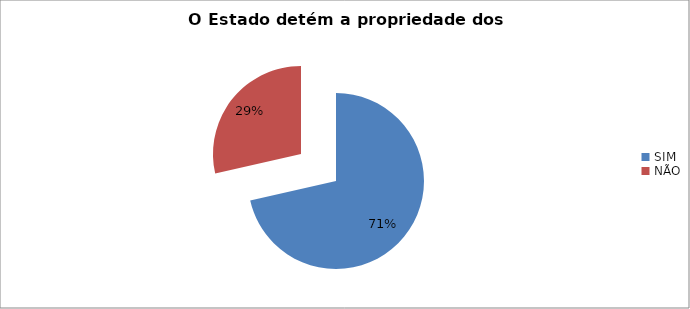
| Category | Series 0 |
|---|---|
| SIM | 0.714 |
| NÃO | 0.286 |